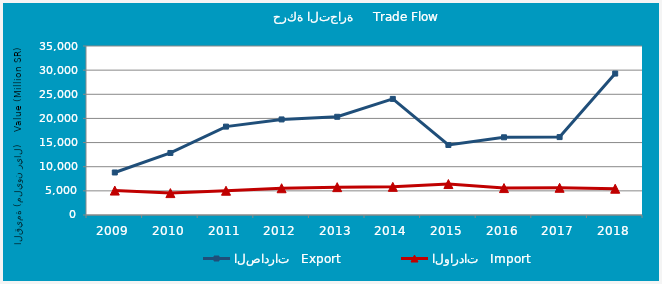
| Category | الصادرات   Export | الواردات   Import |
|---|---|---|
| 2009.0 | 8806917465 | 5057802485 |
| 2010.0 | 12844584051 | 4535631400 |
| 2011.0 | 18305081225 | 5027639086 |
| 2012.0 | 19793313931 | 5540676593 |
| 2013.0 | 20340117361 | 5767259536 |
| 2014.0 | 24042184314 | 5830054742 |
| 2015.0 | 14498635339 | 6413405579 |
| 2016.0 | 16093353417 | 5572421802 |
| 2017.0 | 16135577992 | 5632772174 |
| 2018.0 | 29289310010 | 5442043552 |